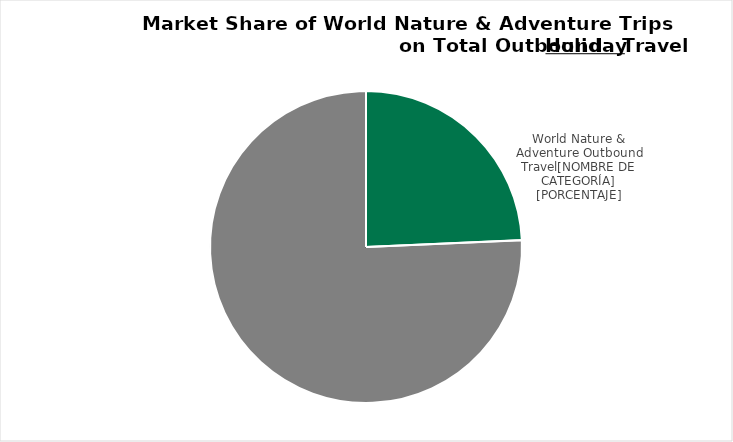
| Category | Series 0 |
|---|---|
| 0 | 0.243 |
| 1 | 0.757 |